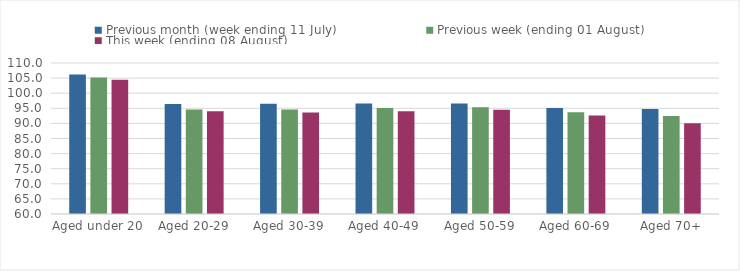
| Category | Previous month (week ending 11 July) | Previous week (ending 01 August) | This week (ending 08 August) |
|---|---|---|---|
| Aged under 20 | 106.198 | 105.204 | 104.471 |
| Aged 20-29 | 96.416 | 94.601 | 93.999 |
| Aged 30-39 | 96.486 | 94.624 | 93.613 |
| Aged 40-49 | 96.565 | 95.081 | 94.03 |
| Aged 50-59 | 96.623 | 95.339 | 94.519 |
| Aged 60-69 | 95.131 | 93.67 | 92.657 |
| Aged 70+ | 94.755 | 92.411 | 90.042 |